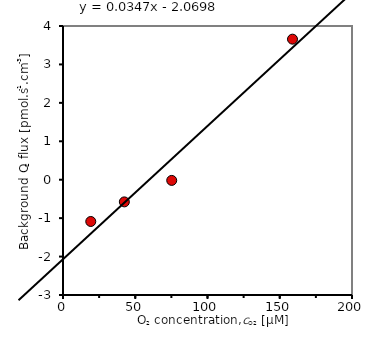
| Category | Series 0 |
|---|---|
| 158.8227 | 3.657 |
| 75.2382 | -0.018 |
| 42.4522 | -0.577 |
| 19.2217 | -1.087 |